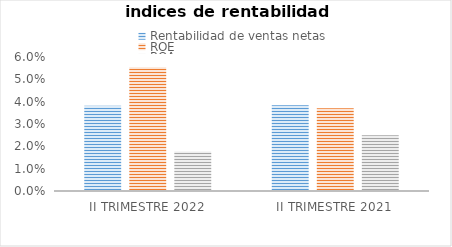
| Category | Rentabilidad de ventas netas | ROE | ROA |
|---|---|---|---|
| II TRIMESTRE 2022 | 0.038 | 0.055 | 0.018 |
| II TRIMESTRE 2021 | 0.038 | 0.037 | 0.025 |